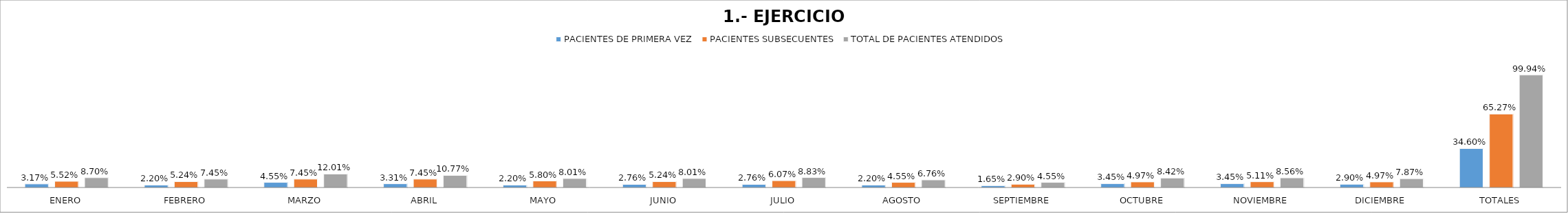
| Category | PACIENTES DE PRIMERA VEZ | PACIENTES SUBSECUENTES | TOTAL DE PACIENTES ATENDIDOS |
|---|---|---|---|
| ENERO | 0.032 | 0.055 | 0.087 |
| FEBRERO | 0.022 | 0.052 | 0.074 |
| MARZO | 0.046 | 0.074 | 0.12 |
| ABRIL | 0.033 | 0.074 | 0.108 |
| MAYO | 0.022 | 0.058 | 0.08 |
| JUNIO | 0.028 | 0.052 | 0.08 |
| JULIO | 0.028 | 0.061 | 0.088 |
| AGOSTO | 0.022 | 0.046 | 0.068 |
| SEPTIEMBRE | 0.016 | 0.029 | 0.046 |
| OCTUBRE | 0.034 | 0.05 | 0.084 |
| NOVIEMBRE | 0.034 | 0.051 | 0.086 |
| DICIEMBRE | 0.029 | 0.05 | 0.079 |
| TOTALES | 0.346 | 0.653 | 0.999 |